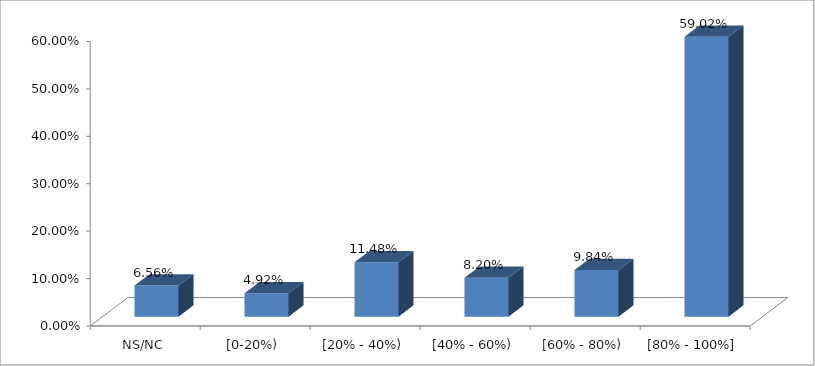
| Category | Series 0 |
|---|---|
| NS/NC | 0.066 |
| [0-20%) | 0.049 |
| [20% - 40%) | 0.115 |
| [40% - 60%) | 0.082 |
| [60% - 80%) | 0.098 |
| [80% - 100%] | 0.59 |